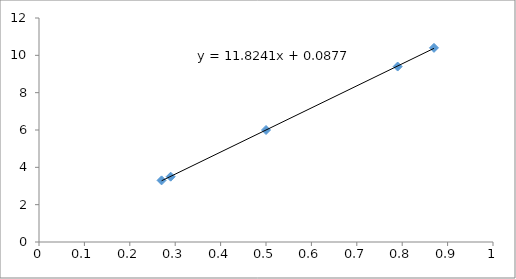
| Category | Series 0 |
|---|---|
| 0.5 | 6 |
| 0.79 | 9.4 |
| 0.29 | 3.5 |
| 0.27 | 3.3 |
| 0.87 | 10.4 |